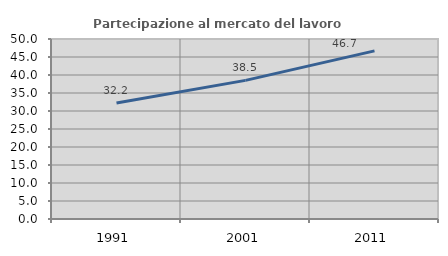
| Category | Partecipazione al mercato del lavoro  femminile |
|---|---|
| 1991.0 | 32.22 |
| 2001.0 | 38.502 |
| 2011.0 | 46.7 |